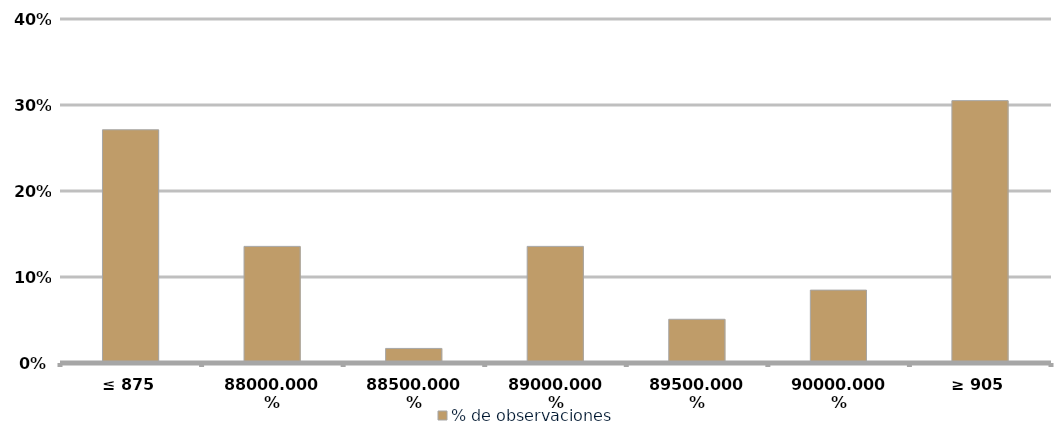
| Category | % de observaciones  |
|---|---|
| ≤ 875 | 0.271 |
| 880 | 0.136 |
| 885 | 0.017 |
| 890 | 0.136 |
| 895 | 0.051 |
| 900 | 0.085 |
| ≥ 905 | 0.305 |